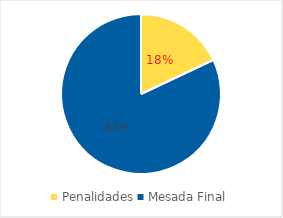
| Category | Series 0 |
|---|---|
| Penalidades | -18 |
| Mesada Final | 82 |